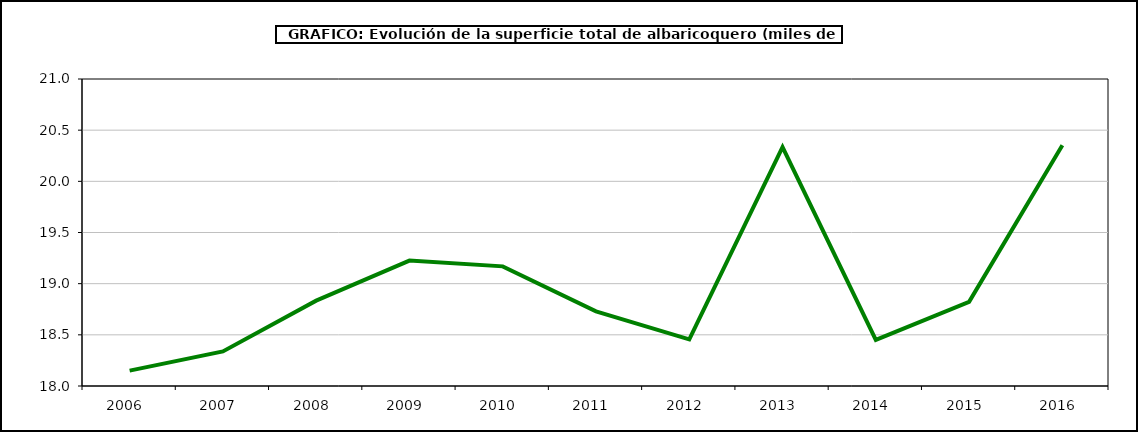
| Category | superficie albaricoquero |
|---|---|
| 2006.0 | 18.15 |
| 2007.0 | 18.338 |
| 2008.0 | 18.834 |
| 2009.0 | 19.226 |
| 2010.0 | 19.169 |
| 2011.0 | 18.729 |
| 2012.0 | 18.455 |
| 2013.0 | 20.334 |
| 2014.0 | 18.451 |
| 2015.0 | 18.822 |
| 2016.0 | 20.353 |